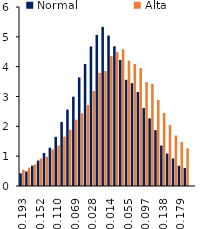
| Category | Normal | Alta |
|---|---|---|
| -0.193085783385048 | 0.427 | 0.541 |
| -0.179293941714688 | 0.486 | 0.618 |
| -0.165502100044327 | 0.683 | 0.727 |
| -0.151710258373966 | 0.853 | 0.924 |
| -0.137918416703606 | 1.106 | 0.98 |
| -0.124126575033245 | 1.285 | 1.226 |
| -0.110334733362885 | 1.647 | 1.361 |
| -0.096542891692524 | 2.148 | 1.658 |
| -0.0827510500221635 | 2.562 | 1.886 |
| -0.0689592083518029 | 2.994 | 2.223 |
| -0.0551673666814423 | 3.638 | 2.438 |
| -0.0413755250110817 | 4.091 | 2.713 |
| -0.0275836833407212 | 4.678 | 3.185 |
| -0.0137918416703606 | 5.063 | 3.792 |
| 0.0 | 5.333 | 3.854 |
| 0.0137918416703606 | 5.043 | 4.355 |
| 0.0275836833407211 | 4.683 | 4.485 |
| 0.0413755250110817 | 4.227 | 4.583 |
| 0.0551673666814423 | 3.559 | 4.202 |
| 0.0689592083518029 | 3.449 | 4.089 |
| 0.0827510500221635 | 3.15 | 3.951 |
| 0.096542891692524 | 2.611 | 3.484 |
| 0.110334733362885 | 2.267 | 3.424 |
| 0.124126575033245 | 1.872 | 2.885 |
| 0.137918416703606 | 1.356 | 2.447 |
| 0.151710258373966 | 1.089 | 2.043 |
| 0.165502100044327 | 0.924 | 1.695 |
| 0.179293941714688 | 0.68 | 1.478 |
| 0.193085783385048 | 0.602 | 1.261 |
| 0.206877625055409 | 0 | 0.002 |